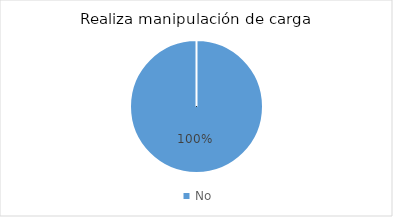
| Category | No |
|---|---|
| No | 7 |